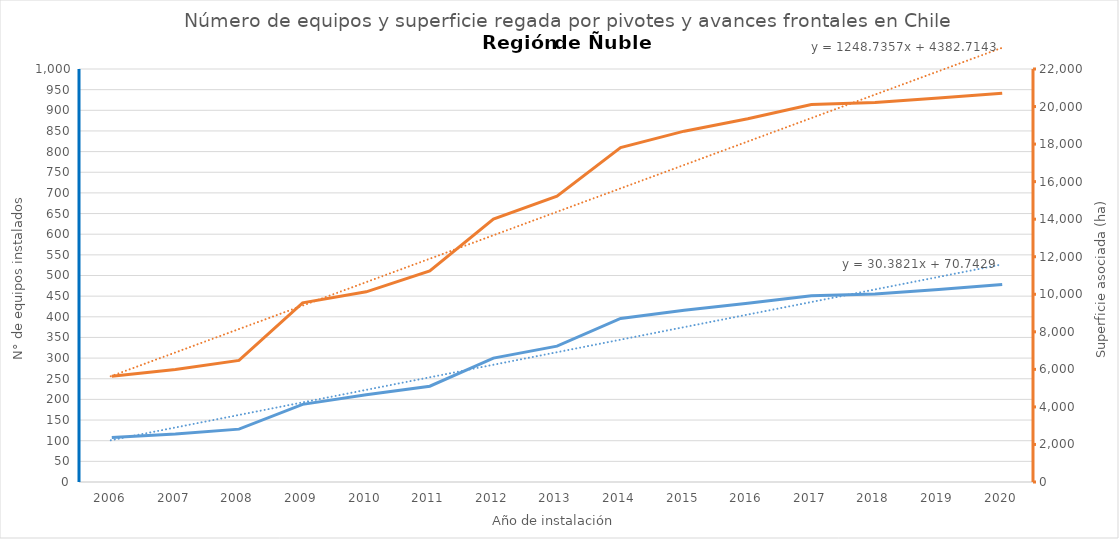
| Category | N° |
|---|---|
| 2006.0 | 108 |
| 2007.0 | 116 |
| 2008.0 | 128 |
| 2009.0 | 188 |
| 2010.0 | 211 |
| 2011.0 | 232 |
| 2012.0 | 300 |
| 2013.0 | 329 |
| 2014.0 | 396 |
| 2015.0 | 416 |
| 2016.0 | 433 |
| 2017.0 | 451 |
| 2018.0 | 455 |
| 2019.0 | 466 |
| 2020.0 | 478 |